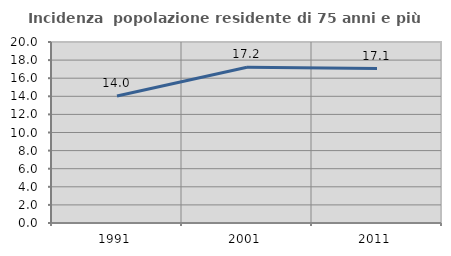
| Category | Incidenza  popolazione residente di 75 anni e più |
|---|---|
| 1991.0 | 14.032 |
| 2001.0 | 17.214 |
| 2011.0 | 17.063 |